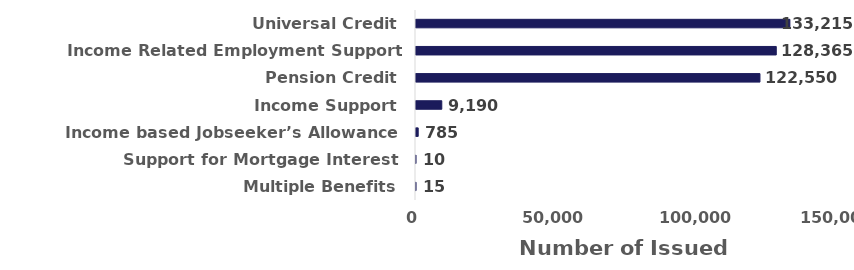
| Category | Number of issued payments |
|---|---|
| Universal Credit | 133215 |
| Income Related Employment Support Allowance | 128365 |
| Pension Credit | 122550 |
| Income Support | 9190 |
| Income based Jobseeker’s Allowance | 785 |
| Support for Mortgage Interest | 10 |
| Multiple Benefits | 15 |